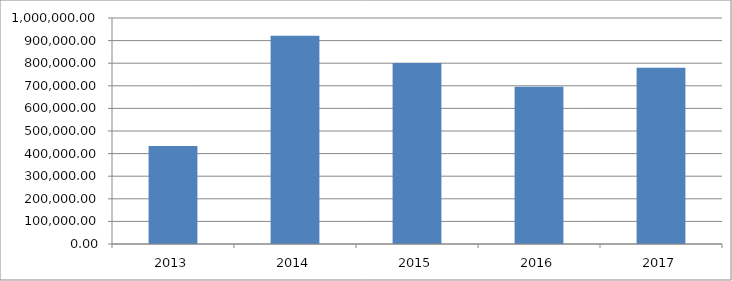
| Category | Series 0 |
|---|---|
| 2013.0 | 433211.104 |
| 2014.0 | 921869.247 |
| 2015.0 | 800670.293 |
| 2016.0 | 695673.661 |
| 2017.0 | 780097.563 |